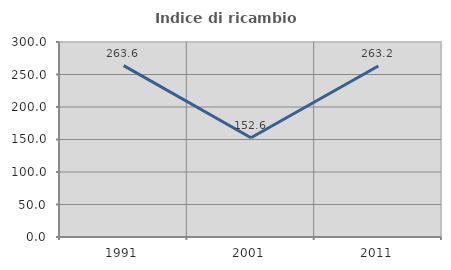
| Category | Indice di ricambio occupazionale  |
|---|---|
| 1991.0 | 263.636 |
| 2001.0 | 152.632 |
| 2011.0 | 263.158 |